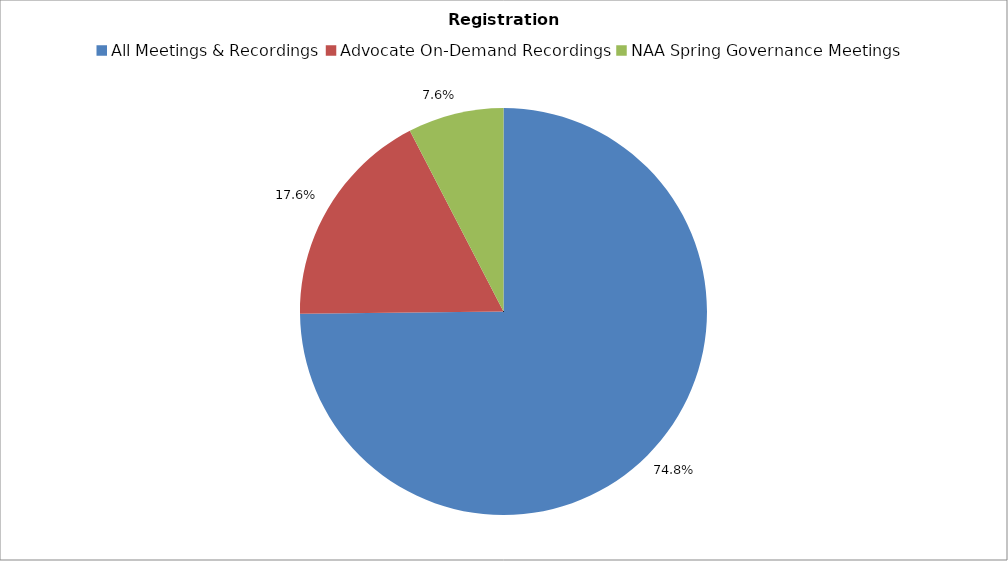
| Category | Series 0 |
|---|---|
| All Meetings & Recordings | 767 |
| Advocate On-Demand Recordings | 180 |
| NAA Spring Governance Meetings | 78 |